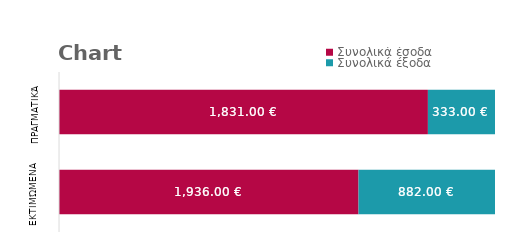
| Category | Συνολικά έσοδα | Συνολικά έξοδα |
|---|---|---|
| Εκτιμώμενα | 1936 | 882 |
| Πραγματικά | 1831 | 333 |